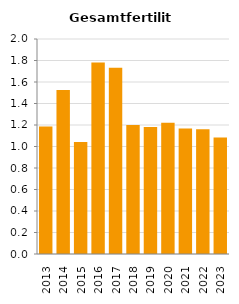
| Category | Gesamtfertilität |
|---|---|
| 2013.0 | 1.185 |
| 2014.0 | 1.525 |
| 2015.0 | 1.041 |
| 2016.0 | 1.782 |
| 2017.0 | 1.732 |
| 2018.0 | 1.201 |
| 2019.0 | 1.182 |
| 2020.0 | 1.22 |
| 2021.0 | 1.168 |
| 2022.0 | 1.16 |
| 2023.0 | 1.084 |